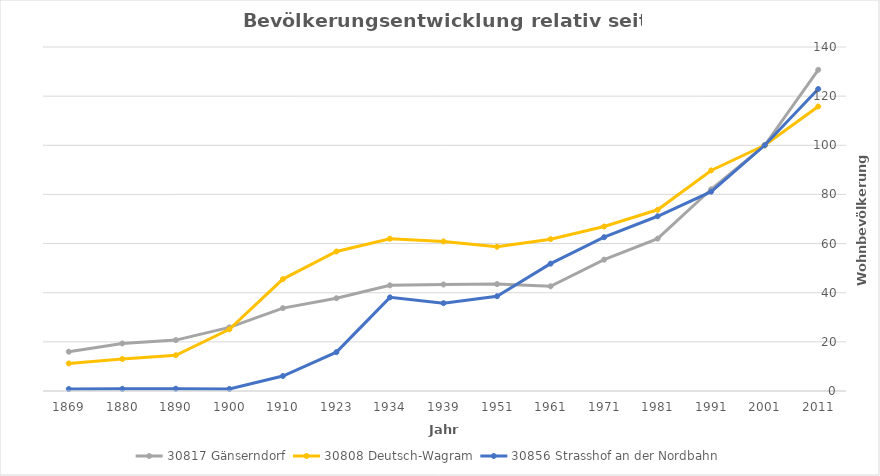
| Category | 30817 | 30808 | 30856 |
|---|---|---|---|
| 2011 | 130.701 | 115.776 | 122.909 |
| 2001 | 100 | 100 | 100 |
| 1991 | 82.101 | 89.762 | 81.124 |
| 1981 | 62.008 | 73.751 | 71.114 |
| 1971 | 53.456 | 66.951 | 62.591 |
| 1961 | 42.608 | 61.795 | 51.823 |
| 1951 | 43.504 | 58.696 | 38.567 |
| 1939 | 43.353 | 60.87 | 35.736 |
| 1934 | 43.012 | 61.971 | 38.11 |
| 1923 | 37.752 | 56.771 | 15.816 |
| 1910 | 33.729 | 45.549 | 6.106 |
| 1900 | 25.908 | 25.103 | 0.844 |
| 1890 | 20.711 | 14.556 | 0.93 |
| 1880 | 19.349 | 13.029 | 0.872 |
| 1869 | 15.981 | 11.207 | 0.801 |